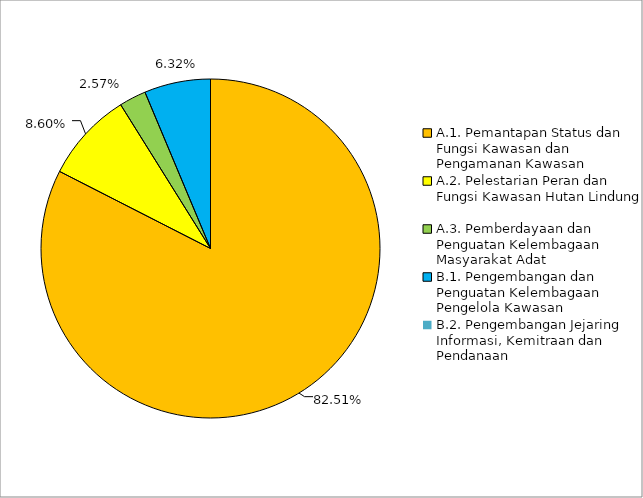
| Category | Series 0 |
|---|---|
| 0 | 0.825 |
| 1 | 0.086 |
| 2 | 0.026 |
| 3 | 0.063 |
| 4 | 0 |